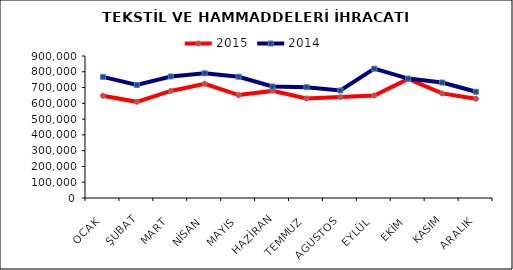
| Category | 2015 | 2014 |
|---|---|---|
| OCAK | 648322.946 | 767869.665 |
| ŞUBAT | 609547.445 | 715848.604 |
| MART | 678568.656 | 770268.379 |
| NİSAN | 724124.851 | 790451.518 |
| MAYIS | 652449.855 | 768619.989 |
| HAZİRAN | 678830.66 | 706505.025 |
| TEMMUZ | 631194.816 | 702427.188 |
| AGUSTOS | 639879.414 | 681658.982 |
| EYLÜL | 649658.085 | 819587.1 |
| EKİM | 755196.314 | 756758.457 |
| KASIM | 662739.576 | 731785.887 |
| ARALIK | 628746.99 | 673226.013 |